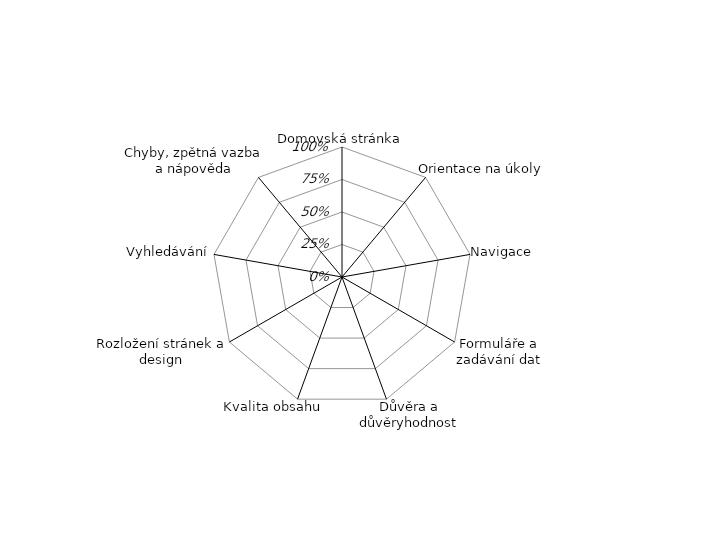
| Category | Series 0 |
|---|---|
| Domovská stránka | 0 |
| Orientace na úkoly | 0 |
| Navigace | 0 |
| Formuláře a zadávání dat | 0 |
| Důvěra a důvěryhodnost | 0 |
| Kvalita obsahu | 0 |
| Rozložení stránek a design | 0 |
| Vyhledávání | 0 |
| Chyby, zpětná vazba a nápověda | 0 |